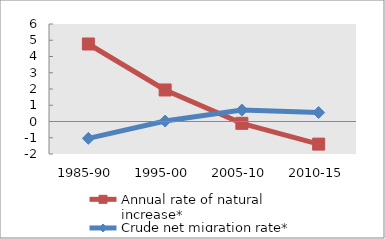
| Category | Annual rate of natural increase* | Crude net migration rate* |
|---|---|---|
| 1985-90 | 4.77 | -1.037 |
| 1995-00 | 1.941 | 0.027 |
| 2005-10 | -0.113 | 0.701 |
| 2010-15 | -1.392 | 0.551 |